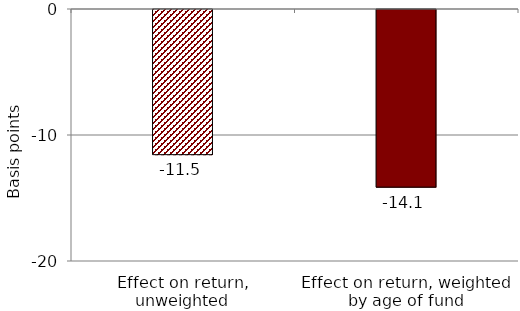
| Category | Series 0 |
|---|---|
| Effect on return, unweighted | -11.52 |
| Effect on return, weighted by age of fund | -14.1 |